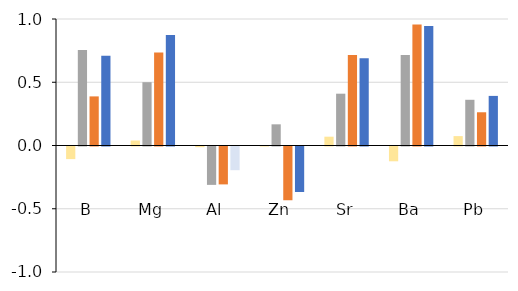
| Category | FO | IOM | ICE | GOM |
|---|---|---|---|---|
| B | -0.1 | 0.756 | 0.388 | 0.709 |
| Mg | 0.039 | 0.5 | 0.736 | 0.873 |
| Al | -0.005 | -0.303 | -0.3 | -0.187 |
| Zn | 0 | 0.167 | -0.425 | -0.36 |
| Sr | 0.07 | 0.41 | 0.716 | 0.69 |
| Ba | -0.117 | 0.716 | 0.956 | 0.945 |
| Pb | 0.074 | 0.361 | 0.263 | 0.392 |